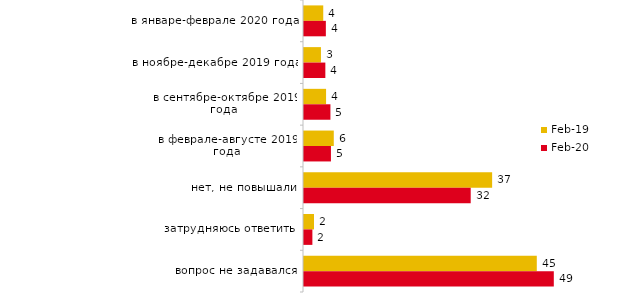
| Category | фев.19 | фев.20 |
|---|---|---|
| в январе-феврале 2020 года | 3.75 | 4.257 |
| в ноябре-декабре 2019 года | 3.3 | 4.158 |
| в сентябре-октябре 2019 года | 4.3 | 5.149 |
| в феврале-августе 2019 года | 5.8 | 5.248 |
| нет, не повышали | 36.65 | 32.475 |
| затрудняюсь ответить | 1.95 | 1.634 |
| вопрос не задавался | 45.35 | 48.663 |